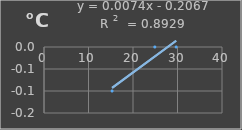
| Category | Temperatura |
|---|---|
| 15.3 | -0.1 |
| 24.9 | 0 |
| 29.7 | 0 |